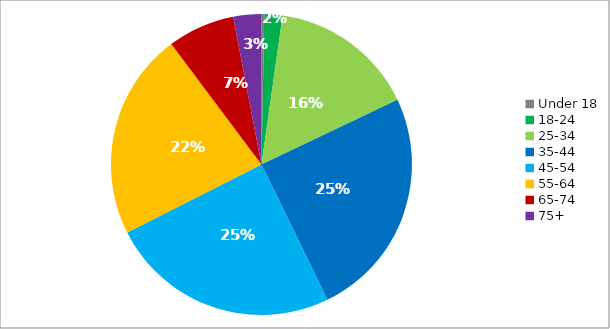
| Category | Responses |
|---|---|
| Under 18 | 0.003 |
| 18-24 | 0.019 |
| 25-34 | 0.157 |
| 35-44 | 0.249 |
| 45-54 | 0.248 |
| 55-64 | 0.222 |
| 65-74 | 0.072 |
| 75+ | 0.03 |